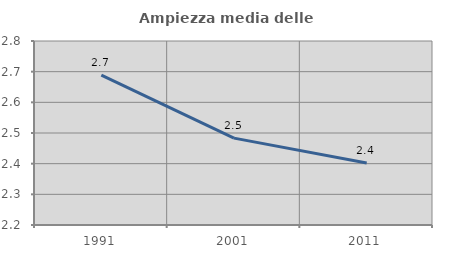
| Category | Ampiezza media delle famiglie |
|---|---|
| 1991.0 | 2.689 |
| 2001.0 | 2.483 |
| 2011.0 | 2.402 |